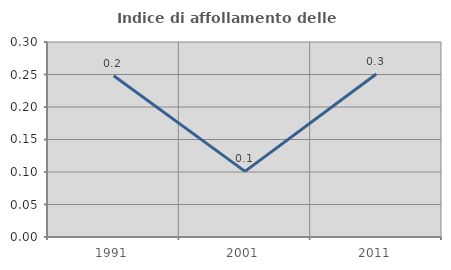
| Category | Indice di affollamento delle abitazioni  |
|---|---|
| 1991.0 | 0.248 |
| 2001.0 | 0.101 |
| 2011.0 | 0.251 |